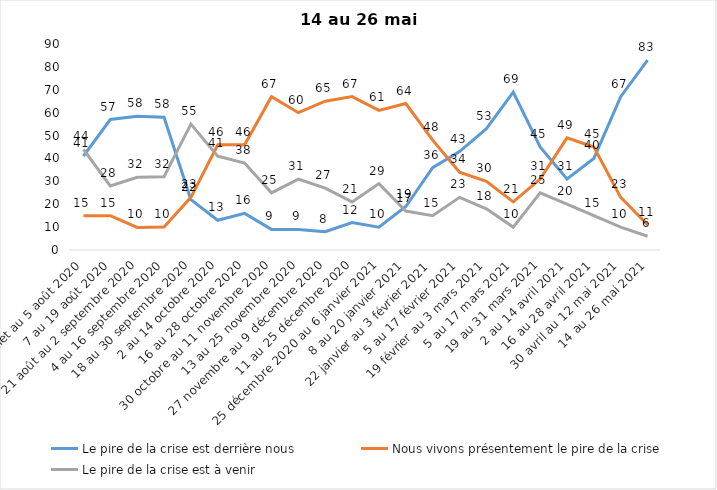
| Category | Le pire de la crise est derrière nous | Nous vivons présentement le pire de la crise | Le pire de la crise est à venir |
|---|---|---|---|
| 24 juillet au 5 août 2020 | 41 | 15 | 44 |
| 7 au 19 août 2020 | 57 | 15 | 28 |
| 21 août au 2 septembre 2020 | 58.39 | 9.84 | 31.77 |
| 4 au 16 septembre 2020 | 58 | 10 | 32 |
| 18 au 30 septembre 2020 | 22 | 23 | 55 |
| 2 au 14 octobre 2020 | 13 | 46 | 41 |
| 16 au 28 octobre 2020 | 16 | 46 | 38 |
| 30 octobre au 11 novembre 2020 | 9 | 67 | 25 |
| 13 au 25 novembre 2020 | 9 | 60 | 31 |
| 27 novembre au 9 décembre 2020 | 8 | 65 | 27 |
| 11 au 25 décembre 2020 | 12 | 67 | 21 |
| 25 décembre 2020 au 6 janvier 2021 | 10 | 61 | 29 |
| 8 au 20 janvier 2021 | 19 | 64 | 17 |
| 22 janvier au 3 février 2021 | 36 | 48 | 15 |
| 5 au 17 février 2021 | 43 | 34 | 23 |
| 19 février au 3 mars 2021 | 53 | 30 | 18 |
| 5 au 17 mars 2021 | 69 | 21 | 10 |
| 19 au 31 mars 2021 | 45 | 31 | 25 |
| 2 au 14 avril 2021 | 31 | 49 | 20 |
| 16 au 28 avril 2021 | 40 | 45 | 15 |
| 30 avril au 12 mai 2021 | 67 | 23 | 10 |
| 14 au 26 mai 2021 | 83 | 11 | 6 |